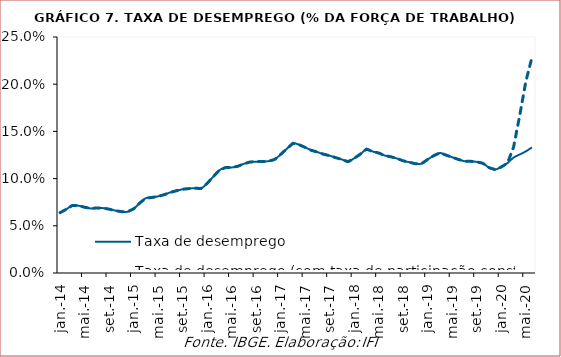
| Category | Taxa de desemprego | Taxa de desemprego (com taxa de participação constante) |
|---|---|---|
| 2014-01-01 | 0.064 | 0.064 |
| 2014-02-01 | 0.067 | 0.067 |
| 2014-03-01 | 0.072 | 0.072 |
| 2014-04-01 | 0.071 | 0.071 |
| 2014-05-01 | 0.07 | 0.07 |
| 2014-06-01 | 0.068 | 0.068 |
| 2014-07-01 | 0.069 | 0.069 |
| 2014-08-01 | 0.069 | 0.069 |
| 2014-09-01 | 0.068 | 0.068 |
| 2014-10-01 | 0.066 | 0.066 |
| 2014-11-01 | 0.065 | 0.065 |
| 2014-12-01 | 0.065 | 0.065 |
| 2015-01-01 | 0.068 | 0.068 |
| 2015-02-01 | 0.074 | 0.074 |
| 2015-03-01 | 0.079 | 0.079 |
| 2015-04-01 | 0.08 | 0.08 |
| 2015-05-01 | 0.081 | 0.081 |
| 2015-06-01 | 0.083 | 0.083 |
| 2015-07-01 | 0.085 | 0.085 |
| 2015-08-01 | 0.087 | 0.087 |
| 2015-09-01 | 0.089 | 0.089 |
| 2015-10-01 | 0.089 | 0.089 |
| 2015-11-01 | 0.09 | 0.09 |
| 2015-12-01 | 0.089 | 0.089 |
| 2016-01-01 | 0.095 | 0.095 |
| 2016-02-01 | 0.102 | 0.102 |
| 2016-03-01 | 0.109 | 0.109 |
| 2016-04-01 | 0.112 | 0.112 |
| 2016-05-01 | 0.112 | 0.112 |
| 2016-06-01 | 0.113 | 0.113 |
| 2016-07-01 | 0.116 | 0.116 |
| 2016-08-01 | 0.118 | 0.118 |
| 2016-09-01 | 0.118 | 0.118 |
| 2016-10-01 | 0.118 | 0.118 |
| 2016-11-01 | 0.118 | 0.118 |
| 2016-12-01 | 0.12 | 0.12 |
| 2017-01-01 | 0.126 | 0.126 |
| 2017-02-01 | 0.132 | 0.132 |
| 2017-03-01 | 0.137 | 0.137 |
| 2017-04-01 | 0.136 | 0.136 |
| 2017-05-01 | 0.133 | 0.133 |
| 2017-06-01 | 0.13 | 0.13 |
| 2017-07-01 | 0.128 | 0.128 |
| 2017-08-01 | 0.126 | 0.126 |
| 2017-09-01 | 0.124 | 0.124 |
| 2017-10-01 | 0.122 | 0.122 |
| 2017-11-01 | 0.12 | 0.12 |
| 2017-12-01 | 0.118 | 0.118 |
| 2018-01-01 | 0.122 | 0.122 |
| 2018-02-01 | 0.126 | 0.126 |
| 2018-03-01 | 0.131 | 0.131 |
| 2018-04-01 | 0.129 | 0.129 |
| 2018-05-01 | 0.127 | 0.127 |
| 2018-06-01 | 0.124 | 0.124 |
| 2018-07-01 | 0.123 | 0.123 |
| 2018-08-01 | 0.121 | 0.121 |
| 2018-09-01 | 0.119 | 0.119 |
| 2018-10-01 | 0.117 | 0.117 |
| 2018-11-01 | 0.116 | 0.116 |
| 2018-12-01 | 0.116 | 0.116 |
| 2019-01-01 | 0.12 | 0.12 |
| 2019-02-01 | 0.124 | 0.124 |
| 2019-03-01 | 0.127 | 0.127 |
| 2019-04-01 | 0.125 | 0.125 |
| 2019-05-01 | 0.123 | 0.123 |
| 2019-06-01 | 0.12 | 0.12 |
| 2019-07-01 | 0.118 | 0.118 |
| 2019-08-01 | 0.118 | 0.118 |
| 2019-09-01 | 0.118 | 0.118 |
| 2019-10-01 | 0.116 | 0.116 |
| 2019-11-01 | 0.112 | 0.112 |
| 2019-12-01 | 0.11 | 0.11 |
| 2020-01-01 | 0.112 | 0.112 |
| 2020-02-01 | 0.116 | 0.116 |
| 2020-03-01 | 0.122 | 0.133 |
| 2020-04-01 | 0.126 | 0.167 |
| 2020-05-01 | 0.129 | 0.203 |
| 2020-06-01 | 0.133 | 0.228 |